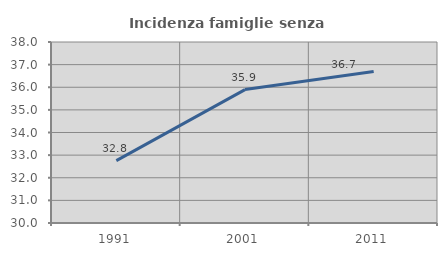
| Category | Incidenza famiglie senza nuclei |
|---|---|
| 1991.0 | 32.759 |
| 2001.0 | 35.897 |
| 2011.0 | 36.697 |